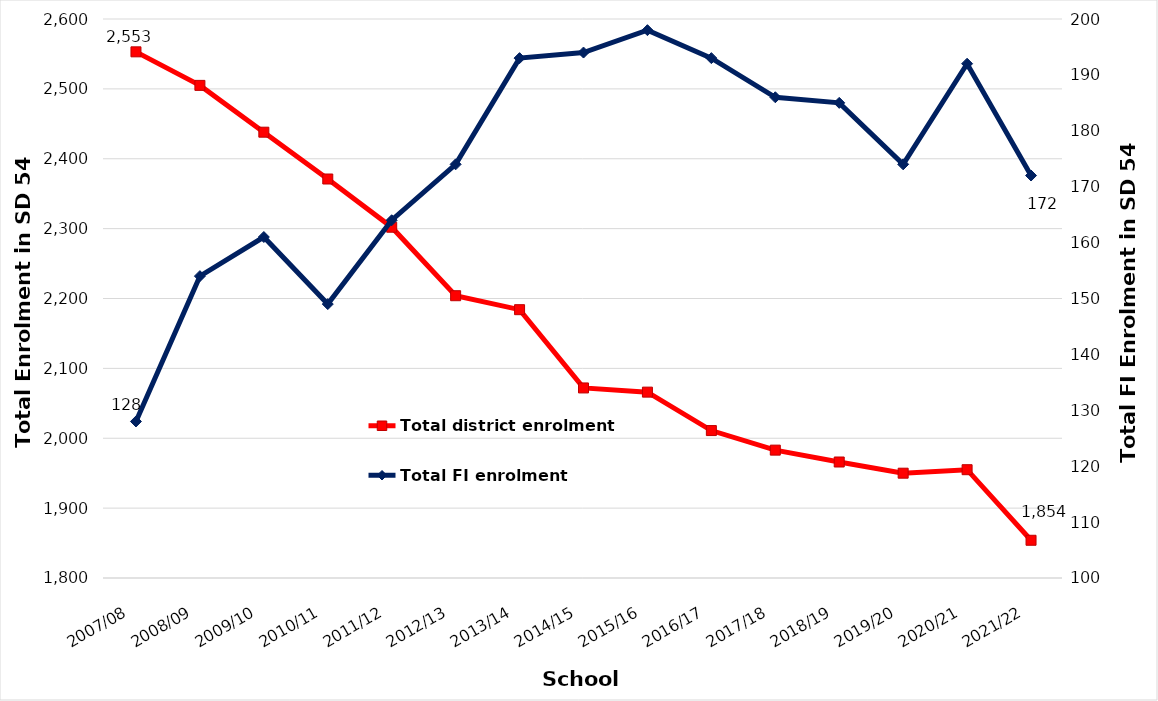
| Category | Total district enrolment  |
|---|---|
| 2007/08 | 2553 |
| 2008/09 | 2505 |
| 2009/10 | 2438 |
| 2010/11 | 2371 |
| 2011/12 | 2302 |
| 2012/13 | 2204 |
| 2013/14 | 2184 |
| 2014/15 | 2072 |
| 2015/16 | 2066 |
| 2016/17 | 2011 |
| 2017/18 | 1983 |
| 2018/19 | 1966 |
| 2019/20 | 1950 |
| 2020/21 | 1955 |
| 2021/22 | 1854 |